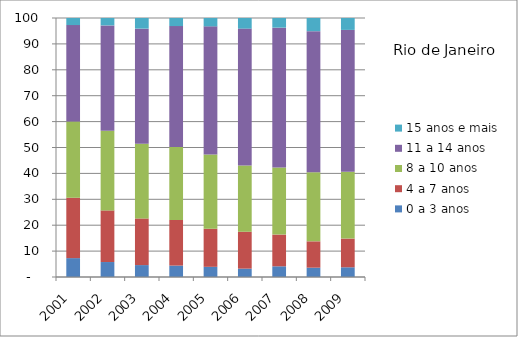
| Category | 0 a 3 anos | 4 a 7 anos | 8 a 10 anos | 11 a 14 anos | 15 anos e mais |
|---|---|---|---|---|---|
| 2001.0 | 7.29 | 23.32 | 29.4 | 37.26 | 2.74 |
| 2002.0 | 5.78 | 19.94 | 30.75 | 40.67 | 2.87 |
| 2003.0 | 4.6 | 18.01 | 28.85 | 44.43 | 4.11 |
| 2004.0 | 4.41 | 17.6 | 28.15 | 46.72 | 3.12 |
| 2005.0 | 3.93 | 14.7 | 28.65 | 49.49 | 3.23 |
| 2006.0 | 3.23 | 14.26 | 25.58 | 52.83 | 4.09 |
| 2007.0 | 4.13 | 12.25 | 25.86 | 54.03 | 3.73 |
| 2008.0 | 3.6 | 10.17 | 26.69 | 54.45 | 5.08 |
| 2009.0 | 3.75 | 11.09 | 25.82 | 54.74 | 4.61 |